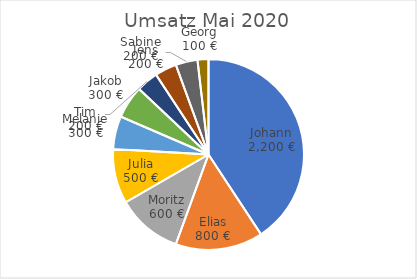
| Category | Umsatz Mai 2020 |
|---|---|
| Johann | 2200 |
| Elias | 800 |
| Moritz | 600 |
| Julia | 500 |
| Melanie | 300 |
| Jakob | 300 |
| Tim | 200 |
| Sabine | 200 |
| Jens | 200 |
| Georg | 100 |